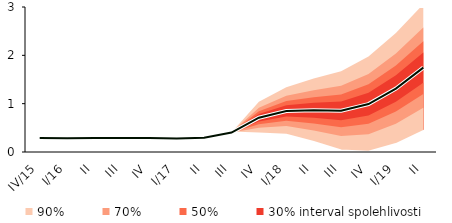
| Category | linka | Centerline |
|---|---|---|
| IV/15 | 0.29 | 0.29 |
| I/16 | 0.286 | 0.286 |
| II | 0.29 | 0.29 |
| III | 0.29 | 0.29 |
| IV | 0.289 | 0.289 |
| I/17 | 0.28 | 0.28 |
| II | 0.294 | 0.294 |
| III | 0.402 | 0.402 |
| IV | 0.709 | 0.709 |
| I/18 | 0.849 | 0.849 |
| II | 0.863 | 0.863 |
| III | 0.852 | 0.852 |
| IV | 0.991 | 0.991 |
| I/19 | 1.312 | 1.312 |
| II | 1.746 | 1.746 |